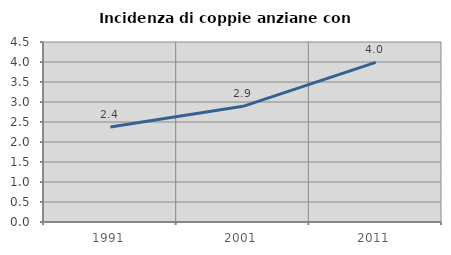
| Category | Incidenza di coppie anziane con figli |
|---|---|
| 1991.0 | 2.375 |
| 2001.0 | 2.892 |
| 2011.0 | 3.99 |